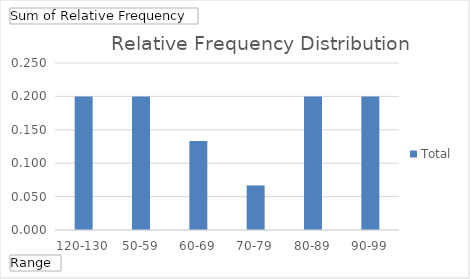
| Category | Total |
|---|---|
| 120-130 | 0.2 |
| 50-59 | 0.2 |
| 60-69 | 0.133 |
| 70-79 | 0.067 |
| 80-89 | 0.2 |
| 90-99 | 0.2 |